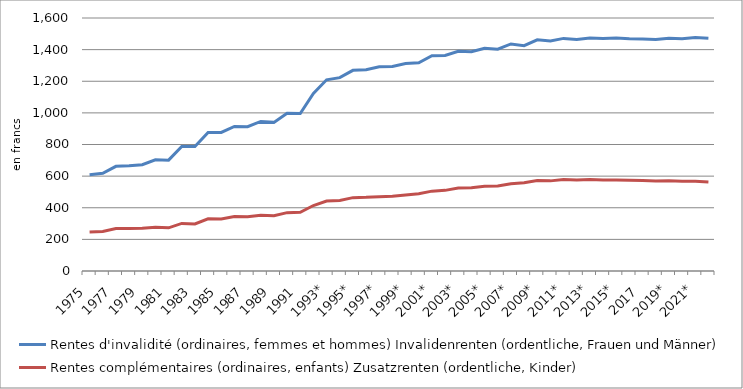
| Category | Rentes d'invalidité (ordinaires, femmes et hommes) | Rentes complémentaires (ordinaires, enfants) |
|---|---|---|
| 1975 | 609 | 247 |
| 1976 | 618 | 250 |
| 1977 | 662 | 268 |
| 1978 | 666 | 268 |
| 1979 | 672 | 270 |
| 1980* | 703 | 277 |
| 1981 | 701 | 273 |
| 1982* | 788 | 301 |
| 1983 | 787 | 298 |
| 1984* | 876 | 330 |
| 1985 | 876 | 329 |
| 1986* | 914 | 344 |
| 1987 | 913 | 343 |
| 1988* | 946 | 353 |
| 1989 | 940 | 349 |
| 1990* | 998 | 369 |
| 1991 | 996 | 371 |
| 1992* | 1123 | 414 |
| 1993* | 1209 | 442 |
| 1994 | 1223 | 446 |
| 1995* | 1269 | 464 |
| 1996 | 1273 | 466 |
| 1997* | 1292 | 470 |
| 1998 | 1294 | 472 |
| 1999* | 1312 | 481 |
| 2000 | 1317 | 488 |
| 2001* | 1362 | 505 |
| 2002 | 1363 | 510 |
| 2003* | 1390 | 525 |
| 2004 | 1387 | 526 |
| 2005* | 1409 | 536 |
| 2006 | 1403 | 537 |
| 2007* | 1436 | 552 |
| 2008 | 1425 | 558 |
| 2009* | 1462 | 572 |
| 2010 | 1454 | 570 |
| 2011* | 1471 | 578 |
| 2012 | 1464 | 575 |
| 2013* | 1473 | 578 |
| 2014 | 1471 | 576 |
| 2015* | 1473 | 576 |
| 2016 | 1469 | 574 |
| 2017 | 1467 | 572 |
| 2018 | 1463.967 | 568.97 |
| 2019* | 1471.778 | 570.573 |
| 2020 | 1468.548 | 567.536 |
| 2021* | 1476.835 | 567.411 |
| 2022 | 1471.942 | 562.236 |